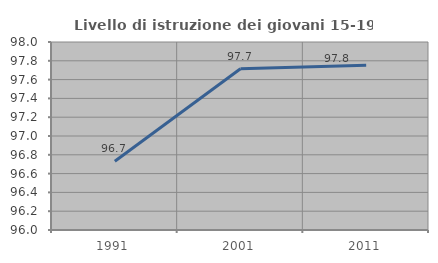
| Category | Livello di istruzione dei giovani 15-19 anni |
|---|---|
| 1991.0 | 96.731 |
| 2001.0 | 97.716 |
| 2011.0 | 97.753 |